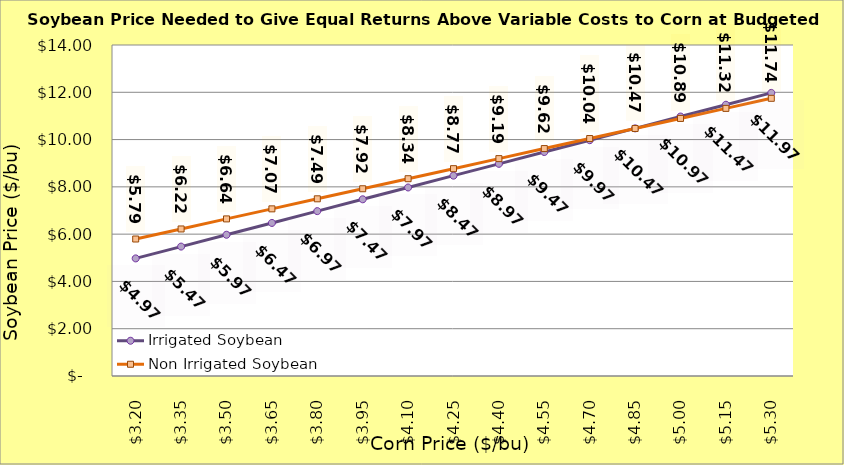
| Category | Irrigated Soybean | Non Irrigated Soybean |
|---|---|---|
| 3.2 | 4.974 | 5.794 |
| 3.35 | 5.474 | 6.219 |
| 3.5 | 5.974 | 6.644 |
| 3.65 | 6.474 | 7.069 |
| 3.8 | 6.974 | 7.494 |
| 3.9499999999999997 | 7.474 | 7.919 |
| 4.1 | 7.974 | 8.344 |
| 4.25 | 8.474 | 8.769 |
| 4.4 | 8.974 | 9.194 |
| 4.550000000000001 | 9.474 | 9.619 |
| 4.700000000000001 | 9.974 | 10.044 |
| 4.850000000000001 | 10.474 | 10.469 |
| 5.000000000000002 | 10.974 | 10.894 |
| 5.150000000000002 | 11.474 | 11.319 |
| 5.3000000000000025 | 11.974 | 11.744 |